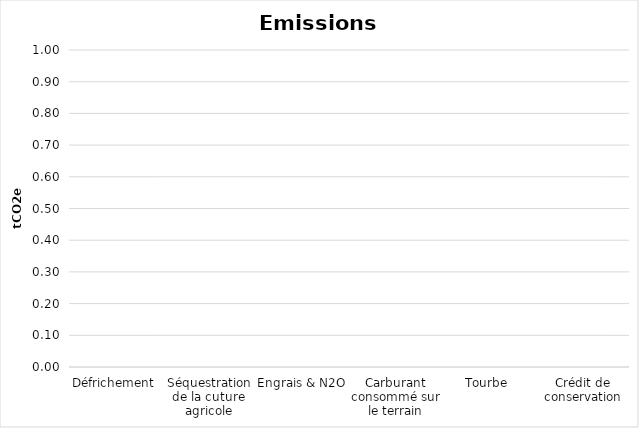
| Category | Series 0 |
|---|---|
| Défrichement | 0 |
| Séquestration de la cuture agricole | 0 |
| Engrais & N2O | 0 |
| Carburant consommé sur le terrain | 0 |
| Tourbe | 0 |
| Crédit de conservation | 0 |